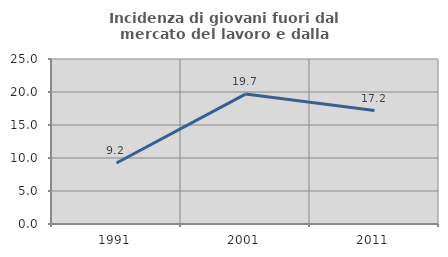
| Category | Incidenza di giovani fuori dal mercato del lavoro e dalla formazione  |
|---|---|
| 1991.0 | 9.247 |
| 2001.0 | 19.686 |
| 2011.0 | 17.188 |